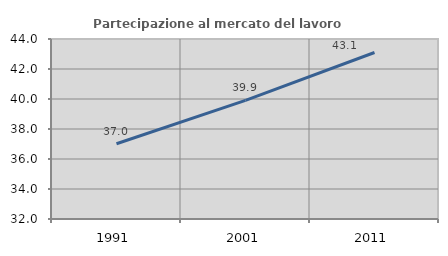
| Category | Partecipazione al mercato del lavoro  femminile |
|---|---|
| 1991.0 | 37.014 |
| 2001.0 | 39.905 |
| 2011.0 | 43.099 |